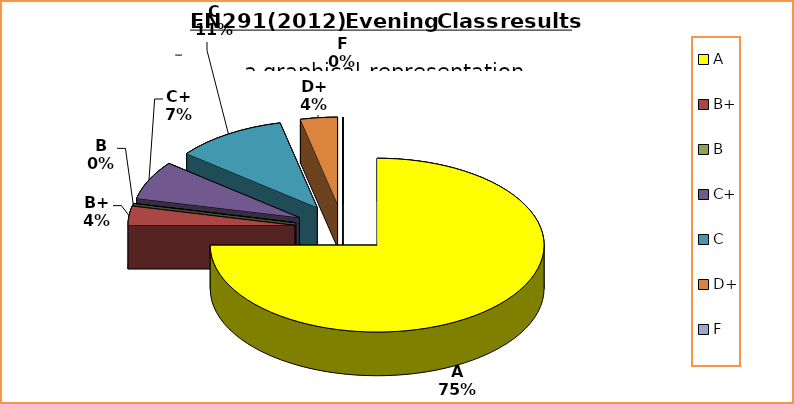
| Category | Series 0 |
|---|---|
| A | 21 |
| B+ | 1 |
| B | 0 |
| C+ | 2 |
| C | 3 |
| D+ | 1 |
| F | 0 |